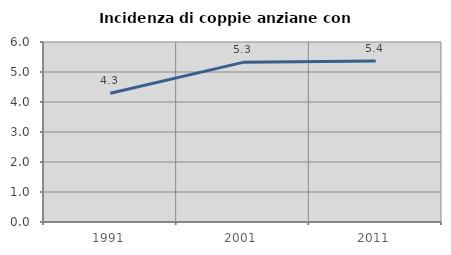
| Category | Incidenza di coppie anziane con figli |
|---|---|
| 1991.0 | 4.289 |
| 2001.0 | 5.322 |
| 2011.0 | 5.369 |